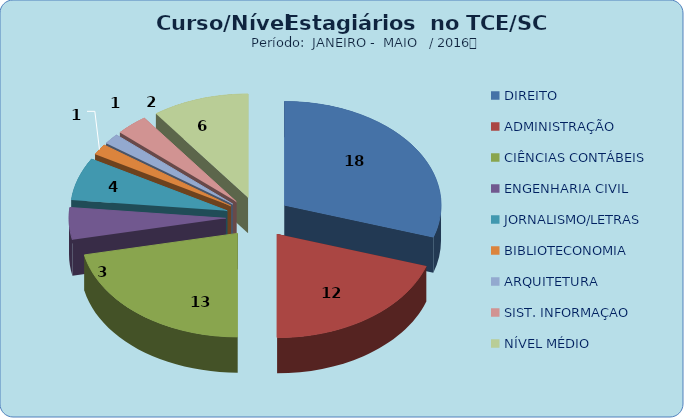
| Category | Series 0 |
|---|---|
| DIREITO | 18 |
| ADMINISTRAÇÃO | 12 |
| CIÊNCIAS CONTÁBEIS | 13 |
| ENGENHARIA CIVIL | 3 |
| JORNALISMO/LETRAS | 4 |
| BIBLIOTECONOMIA | 1 |
| ARQUITETURA | 1 |
| SIST. INFORMAÇAO | 2 |
| NÍVEL MÉDIO | 6 |